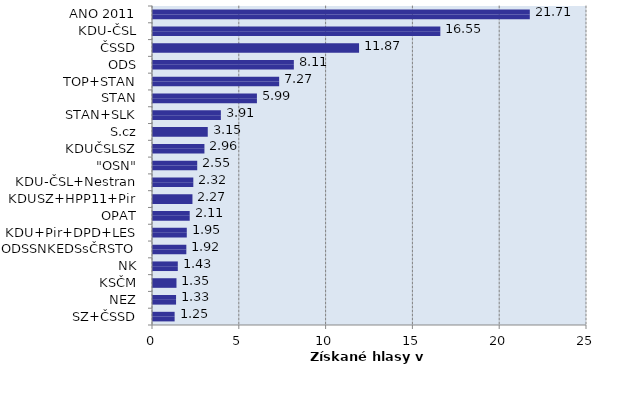
| Category | Series 1 | Series 0 |
|---|---|---|
| SZ+ČSSD | 1.246 | 1.246 |
| NEZ | 1.328 | 1.328 |
| KSČM | 1.353 | 1.353 |
| NK | 1.428 | 1.428 |
| ODSSNKEDSsČRSTO | 1.92 | 1.92 |
| KDU+Pir+DPD+LES | 1.947 | 1.947 |
| OPAT | 2.114 | 2.114 |
| KDUSZ+HPP11+Pir | 2.273 | 2.273 |
| KDU-ČSL+Nestran | 2.322 | 2.322 |
| "OSN" | 2.548 | 2.548 |
| KDUČSLSZ | 2.963 | 2.963 |
| S.cz | 3.154 | 3.154 |
| STAN+SLK | 3.909 | 3.909 |
| STAN | 5.987 | 5.987 |
| TOP+STAN | 7.267 | 7.267 |
| ODS | 8.113 | 8.113 |
| ČSSD | 11.87 | 11.87 |
| KDU-ČSL | 16.551 | 16.551 |
| ANO 2011 | 21.706 | 21.706 |